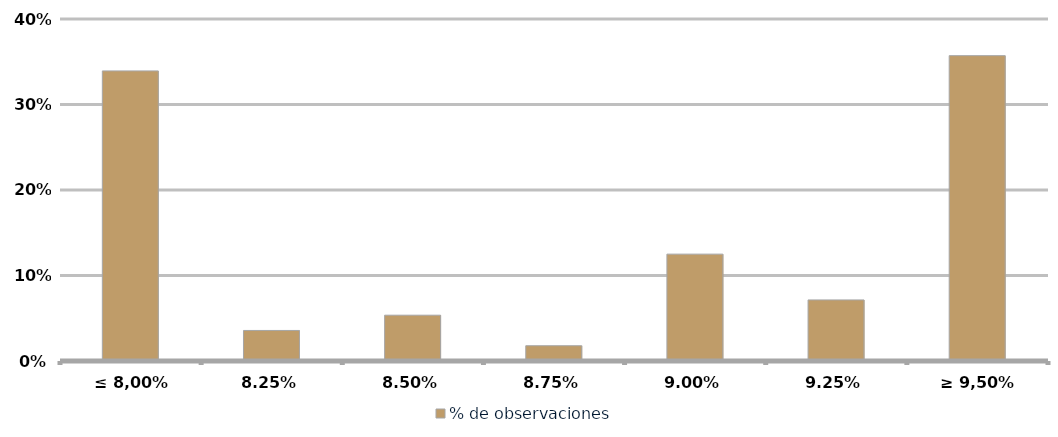
| Category | % de observaciones  |
|---|---|
| ≤ 8,00% | 0.339 |
| 8,25% | 0.036 |
| 8,50% | 0.054 |
| 8,75% | 0.018 |
| 9,00% | 0.125 |
| 9,25% | 0.071 |
| ≥ 9,50% | 0.357 |